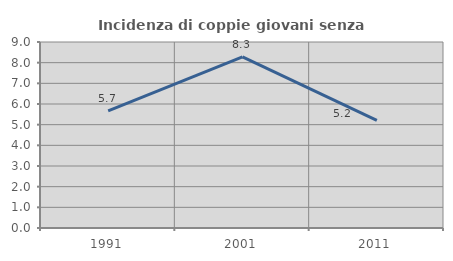
| Category | Incidenza di coppie giovani senza figli |
|---|---|
| 1991.0 | 5.663 |
| 2001.0 | 8.277 |
| 2011.0 | 5.21 |